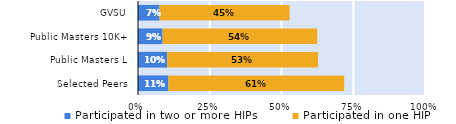
| Category | Participated in two or more HIPs | Participated in one HIP |
|---|---|---|
| Selected Peers | 0.106 | 0.613 |
| Public Masters L | 0.102 | 0.525 |
| Public Masters 10K+ | 0.086 | 0.539 |
| GVSU | 0.075 | 0.453 |